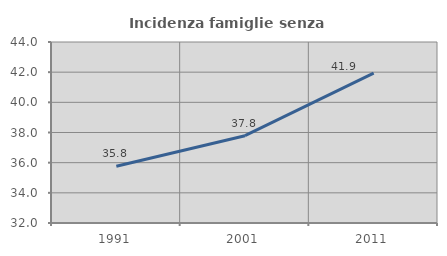
| Category | Incidenza famiglie senza nuclei |
|---|---|
| 1991.0 | 35.757 |
| 2001.0 | 37.788 |
| 2011.0 | 41.932 |